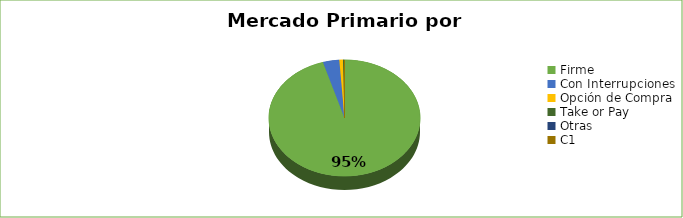
| Category | Series 0 |
|---|---|
| Firme | 6592634 |
| Con Interrupciones | 241600 |
| Opción de Compra | 53900 |
| Take or Pay | 20500 |
| Otras | 900 |
| C1 | 170 |